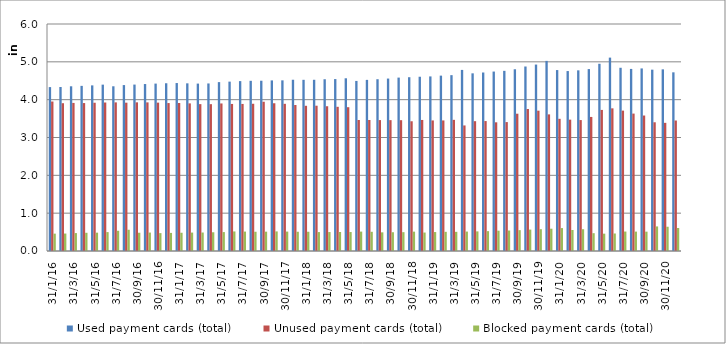
| Category | Used payment cards (total) | Unused payment cards (total) | Blocked payment cards (total) |
|---|---|---|---|
| 31/1/16 | 4332390 | 3951033 | 458740 |
| 29/2/16 | 4335492 | 3906412 | 461489 |
| 31/3/16 | 4353588 | 3913926 | 473928 |
| 30/4/16 | 4364667 | 3910281 | 481502 |
| 31/5/16 | 4377599 | 3918512 | 484770 |
| 30/6/16 | 4397146 | 3925078 | 499871 |
| 31/7/16 | 4353754 | 3928567 | 534914 |
| 31/8/16 | 4385699 | 3920372 | 561363 |
| 30/9/16 | 4398873 | 3929420 | 482990 |
| 31/10/16 | 4413327 | 3928433 | 487271 |
| 30/11/16 | 4424704 | 3921612 | 472655 |
| 31/12/16 | 4433927 | 3910471 | 478422 |
| 31/1/17 | 4439440 | 3911465 | 482368 |
| 28/2/17 | 4431781 | 3901773 | 486947 |
| 31/3/17 | 4424764 | 3882003 | 488411 |
| 30/4/17 | 4428633 | 3880936 | 495125 |
| 31/5/17 | 4463865 | 3899703 | 500119 |
| 30/6/17 | 4476802 | 3886985 | 516888 |
| 31/7/17 | 4490420 | 3887104 | 513284 |
| 31/8/17 | 4498388 | 3891883 | 508628 |
| 30/9/17 | 4500635 | 3945062 | 510835 |
| 31/10/17 | 4508944 | 3905406 | 517837 |
| 30/11/17 | 4510523 | 3890324 | 513196 |
| 31/12/17 | 4526497 | 3858583 | 509092 |
| 31/1/18 | 4524766 | 3838253 | 509071 |
| 28/2/18 | 4525648 | 3840461 | 500269 |
| 31/3/18 | 4539797 | 3826299 | 500768 |
| 30/4/18 | 4544194 | 3811134 | 502777 |
| 31/5/18 | 4565296 | 3800786 | 501103 |
| 30/6/18 | 4495006 | 3462520 | 512981 |
| 31/7/18 | 4523110 | 3462912 | 507713 |
| 31/8/18 | 4540386 | 3460341 | 493221 |
| 30/9/18 | 4557805 | 3458935 | 496003 |
| 31/10/18 | 4583262 | 3457706 | 497724 |
| 30/11/18 | 4593388 | 3429288 | 511710 |
| 31/12/18 | 4606030 | 3463649 | 487904 |
| 31/1/19 | 4614465 | 3450934 | 500800 |
| 28/2/19 | 4635367 | 3450958 | 506797 |
| 31/3/19 | 4647942 | 3466739 | 506513 |
| 30/4/19 | 4786497 | 3318511 | 513607 |
| 31/5/19 | 4695934 | 3431348 | 518465 |
| 30/6/19 | 4717989 | 3434578 | 524706 |
| 31/7/19 | 4742986 | 3401654 | 537018 |
| 31/8/19 | 4761950 | 3407374 | 541512 |
| 30/9/19 | 4803712 | 3628645 | 551335 |
| 31/10/19 | 4876662 | 3753964 | 565949 |
| 30/11/19 | 4927966 | 3708811 | 576234 |
| 31/12/19 | 5024824 | 3610694 | 589334 |
| 31/1/20 | 4782490 | 3493724 | 606068 |
| 29/2/20 | 4756251 | 3471626 | 555521 |
| 31/3/20 | 4775165 | 3460865 | 575448 |
| 30/4/20 | 4808209 | 3543438 | 470873 |
| 31/5/20 | 4948825 | 3729008 | 458187 |
| 30/6/20 | 5111414 | 3770791 | 462767 |
| 31/7/20 | 4842978 | 3710532 | 514123 |
| 31/8/20 | 4812792 | 3631954 | 512441 |
| 30/9/20 | 4825791 | 3580901 | 511079 |
| 31/10/20 | 4792919 | 3402533 | 649391 |
| 30/11/20 | 4801372 | 3387387 | 641134 |
| 31/12/20 | 4722659 | 3449204 | 608393 |